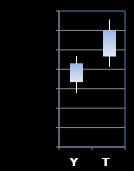
| Category | Series 0 | Series 1 | Series 2 | Series 3 |
|---|---|---|---|---|
| Y | 123.734 | 123.867 | 123.68 | 123.828 |
| T | 123.867 | 124.055 | 123.812 | 124 |